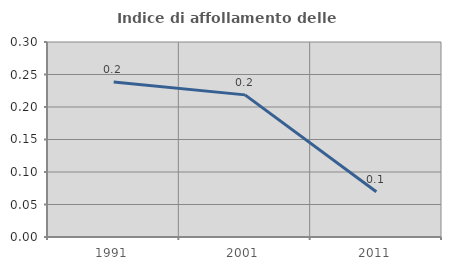
| Category | Indice di affollamento delle abitazioni  |
|---|---|
| 1991.0 | 0.238 |
| 2001.0 | 0.219 |
| 2011.0 | 0.07 |